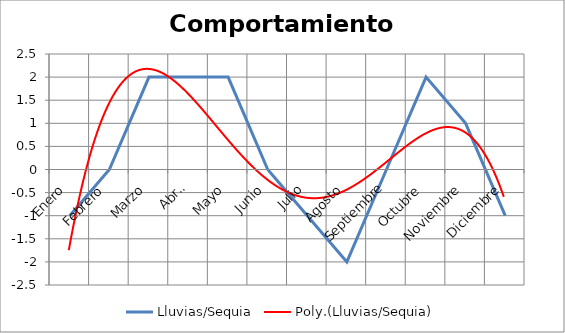
| Category | Lluvias/Sequia |
|---|---|
| Enero | -1 |
| Febrero | 0 |
| Marzo | 2 |
| Abril | 2 |
| Mayo | 2 |
| Junio | 0 |
| Julio | -1 |
| Agosto | -2 |
| Septiembre | 0 |
| Octubre | 2 |
| Noviembre | 1 |
| Diciembre | -1 |